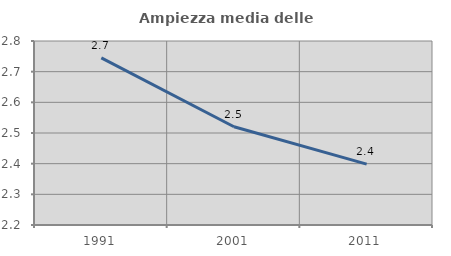
| Category | Ampiezza media delle famiglie |
|---|---|
| 1991.0 | 2.745 |
| 2001.0 | 2.52 |
| 2011.0 | 2.398 |